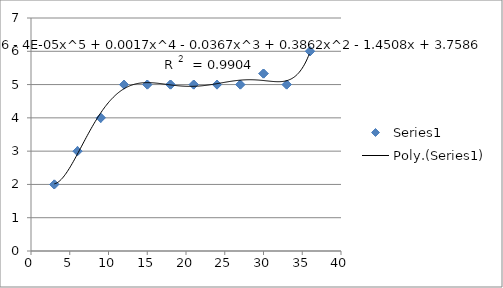
| Category | Series 0 |
|---|---|
| 36.0 | 6 |
| 36.0 | 6 |
| 36.0 | 6 |
| 33.0 | 5 |
| 33.0 | 5 |
| 33.0 | 5 |
| 30.0 | 5.33 |
| 30.0 | 5.33 |
| 30.0 | 5.33 |
| 27.0 | 5 |
| 27.0 | 5 |
| 27.0 | 5 |
| 24.0 | 5 |
| 24.0 | 5 |
| 24.0 | 5 |
| 21.0 | 5 |
| 21.0 | 5 |
| 21.0 | 5 |
| 18.0 | 5 |
| 18.0 | 5 |
| 18.0 | 5 |
| 15.0 | 5 |
| 15.0 | 5 |
| 15.0 | 5 |
| 12.0 | 5 |
| 12.0 | 5 |
| 12.0 | 5 |
| 9.0 | 4 |
| 9.0 | 4 |
| 9.0 | 4 |
| 6.0 | 3 |
| 6.0 | 3 |
| 6.0 | 3 |
| 3.0 | 2 |
| 3.0 | 2 |
| 3.0 | 2 |